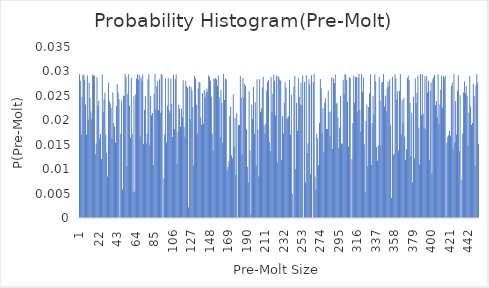
| Category | P.D.F(Pre-Molt) |
|---|---|
| 0 | 0.029 |
| 1 | 0.028 |
| 2 | 0.017 |
| 3 | 0.025 |
| 4 | 0.029 |
| 5 | 0.029 |
| 6 | 0.028 |
| 7 | 0.023 |
| 8 | 0.017 |
| 9 | 0.029 |
| 10 | 0.02 |
| 11 | 0.028 |
| 12 | 0.025 |
| 13 | 0.022 |
| 14 | 0.02 |
| 15 | 0.029 |
| 16 | 0.029 |
| 17 | 0.029 |
| 18 | 0.013 |
| 19 | 0.015 |
| 20 | 0.029 |
| 21 | 0.023 |
| 22 | 0.024 |
| 23 | 0.016 |
| 24 | 0.017 |
| 25 | 0.012 |
| 26 | 0.029 |
| 27 | 0.022 |
| 28 | 0.024 |
| 29 | 0.026 |
| 30 | 0.017 |
| 31 | 0.013 |
| 32 | 0.008 |
| 33 | 0.028 |
| 34 | 0.024 |
| 35 | 0.023 |
| 36 | 0.023 |
| 37 | 0.016 |
| 38 | 0.026 |
| 39 | 0.019 |
| 40 | 0.019 |
| 41 | 0.015 |
| 42 | 0.023 |
| 43 | 0.027 |
| 44 | 0.026 |
| 45 | 0.024 |
| 46 | 0 |
| 47 | 0.017 |
| 48 | 0.024 |
| 49 | 0.006 |
| 50 | 0.025 |
| 51 | 0.025 |
| 52 | 0.029 |
| 53 | 0.029 |
| 54 | 0.011 |
| 55 | 0.025 |
| 56 | 0.029 |
| 57 | 0.023 |
| 58 | 0.016 |
| 59 | 0.029 |
| 60 | 0.017 |
| 61 | 0.005 |
| 62 | 0.025 |
| 63 | 0.005 |
| 64 | 0.025 |
| 65 | 0.029 |
| 66 | 0.029 |
| 67 | 0.028 |
| 68 | 0.029 |
| 69 | 0.017 |
| 70 | 0.029 |
| 71 | 0.028 |
| 72 | 0.029 |
| 73 | 0.015 |
| 74 | 0.022 |
| 75 | 0.025 |
| 76 | 0.015 |
| 77 | 0.017 |
| 78 | 0.028 |
| 79 | 0.029 |
| 80 | 0.015 |
| 81 | 0.025 |
| 82 | 0.021 |
| 83 | 0.021 |
| 84 | 0.011 |
| 85 | 0.025 |
| 86 | 0.029 |
| 87 | 0.022 |
| 88 | 0.027 |
| 89 | 0.028 |
| 90 | 0.022 |
| 91 | 0.028 |
| 92 | 0.022 |
| 93 | 0.029 |
| 94 | 0.029 |
| 95 | 0 |
| 96 | 0.008 |
| 97 | 0.017 |
| 98 | 0.029 |
| 99 | 0.015 |
| 100 | 0.023 |
| 101 | 0.029 |
| 102 | 0.022 |
| 103 | 0.022 |
| 104 | 0.029 |
| 105 | 0.023 |
| 106 | 0.017 |
| 107 | 0.029 |
| 108 | 0.018 |
| 109 | 0.028 |
| 110 | 0.029 |
| 111 | 0.011 |
| 112 | 0.018 |
| 113 | 0.023 |
| 114 | 0.022 |
| 115 | 0.019 |
| 116 | 0.022 |
| 117 | 0.021 |
| 118 | 0.028 |
| 119 | 0.019 |
| 120 | 0.017 |
| 121 | 0.028 |
| 122 | 0.027 |
| 123 | 0.027 |
| 124 | 0.002 |
| 125 | 0.027 |
| 126 | 0.02 |
| 127 | 0.027 |
| 128 | 0.026 |
| 129 | 0.023 |
| 130 | 0.011 |
| 131 | 0.029 |
| 132 | 0.029 |
| 133 | 0.023 |
| 134 | 0.017 |
| 135 | 0.027 |
| 136 | 0.028 |
| 137 | 0.028 |
| 138 | 0.021 |
| 139 | 0.019 |
| 140 | 0.026 |
| 141 | 0.019 |
| 142 | 0.026 |
| 143 | 0.025 |
| 144 | 0.026 |
| 145 | 0.027 |
| 146 | 0.026 |
| 147 | 0.029 |
| 148 | 0.029 |
| 149 | 0.028 |
| 150 | 0.025 |
| 151 | 0.017 |
| 152 | 0.014 |
| 153 | 0.029 |
| 154 | 0.028 |
| 155 | 0.029 |
| 156 | 0.028 |
| 157 | 0.027 |
| 158 | 0.029 |
| 159 | 0.025 |
| 160 | 0.017 |
| 161 | 0.026 |
| 162 | 0.024 |
| 163 | 0.015 |
| 164 | 0.029 |
| 165 | 0.024 |
| 166 | 0.029 |
| 167 | 0.028 |
| 168 | 0.01 |
| 169 | 0.01 |
| 170 | 0.012 |
| 171 | 0.021 |
| 172 | 0.023 |
| 173 | 0.013 |
| 174 | 0.012 |
| 175 | 0.025 |
| 176 | 0.015 |
| 177 | 0.021 |
| 178 | 0.009 |
| 179 | 0.021 |
| 180 | 0 |
| 181 | 0.019 |
| 182 | 0.019 |
| 183 | 0.029 |
| 184 | 0.025 |
| 185 | 0.013 |
| 186 | 0.029 |
| 187 | 0.025 |
| 188 | 0.027 |
| 189 | 0.027 |
| 190 | 0.018 |
| 191 | 0.01 |
| 192 | 0.007 |
| 193 | 0.026 |
| 194 | 0.014 |
| 195 | 0.001 |
| 196 | 0.023 |
| 197 | 0.02 |
| 198 | 0.027 |
| 199 | 0.017 |
| 200 | 0.024 |
| 201 | 0.011 |
| 202 | 0.028 |
| 203 | 0.018 |
| 204 | 0.008 |
| 205 | 0.028 |
| 206 | 0.022 |
| 207 | 0.022 |
| 208 | 0.027 |
| 209 | 0.029 |
| 210 | 0.019 |
| 211 | 0.017 |
| 212 | 0.019 |
| 213 | 0.026 |
| 214 | 0.028 |
| 215 | 0.028 |
| 216 | 0.016 |
| 217 | 0.014 |
| 218 | 0.029 |
| 219 | 0.022 |
| 220 | 0.025 |
| 221 | 0.029 |
| 222 | 0.028 |
| 223 | 0.021 |
| 224 | 0.029 |
| 225 | 0.011 |
| 226 | 0.029 |
| 227 | 0.029 |
| 228 | 0.028 |
| 229 | 0.028 |
| 230 | 0.012 |
| 231 | 0.021 |
| 232 | 0.017 |
| 233 | 0.024 |
| 234 | 0.028 |
| 235 | 0.027 |
| 236 | 0.02 |
| 237 | 0.021 |
| 238 | 0.021 |
| 239 | 0.028 |
| 240 | 0.017 |
| 241 | 0.025 |
| 242 | 0.005 |
| 243 | 0 |
| 244 | 0.027 |
| 245 | 0.029 |
| 246 | 0.01 |
| 247 | 0.024 |
| 248 | 0.018 |
| 249 | 0.029 |
| 250 | 0.025 |
| 251 | 0.023 |
| 252 | 0.028 |
| 253 | 0.023 |
| 254 | 0.029 |
| 255 | 0 |
| 256 | 0.028 |
| 257 | 0.007 |
| 258 | 0.029 |
| 259 | 0.013 |
| 260 | 0.015 |
| 261 | 0.028 |
| 262 | 0.027 |
| 263 | 0.009 |
| 264 | 0.029 |
| 265 | 0 |
| 266 | 0.028 |
| 267 | 0.029 |
| 268 | 0.008 |
| 269 | 0.006 |
| 270 | 0.017 |
| 271 | 0.016 |
| 272 | 0.011 |
| 273 | 0.019 |
| 274 | 0.028 |
| 275 | 0.027 |
| 276 | 0.017 |
| 277 | 0.022 |
| 278 | 0.013 |
| 279 | 0.024 |
| 280 | 0.024 |
| 281 | 0.018 |
| 282 | 0.018 |
| 283 | 0.026 |
| 284 | 0.022 |
| 285 | 0.017 |
| 286 | 0.022 |
| 287 | 0.029 |
| 288 | 0.014 |
| 289 | 0.029 |
| 290 | 0.028 |
| 291 | 0.029 |
| 292 | 0.023 |
| 293 | 0.024 |
| 294 | 0.021 |
| 295 | 0.014 |
| 296 | 0.019 |
| 297 | 0.025 |
| 298 | 0.015 |
| 299 | 0.015 |
| 300 | 0.028 |
| 301 | 0.025 |
| 302 | 0.029 |
| 303 | 0.029 |
| 304 | 0.028 |
| 305 | 0.024 |
| 306 | 0.015 |
| 307 | 0.029 |
| 308 | 0.029 |
| 309 | 0 |
| 310 | 0.012 |
| 311 | 0.019 |
| 312 | 0.029 |
| 313 | 0.024 |
| 314 | 0.029 |
| 315 | 0.029 |
| 316 | 0.022 |
| 317 | 0.029 |
| 318 | 0.029 |
| 319 | 0.022 |
| 320 | 0.018 |
| 321 | 0.029 |
| 322 | 0.026 |
| 323 | 0.029 |
| 324 | 0.015 |
| 325 | 0.005 |
| 326 | 0.02 |
| 327 | 0.023 |
| 328 | 0.011 |
| 329 | 0.023 |
| 330 | 0.026 |
| 331 | 0.029 |
| 332 | 0.011 |
| 333 | 0.019 |
| 334 | 0.025 |
| 335 | 0.021 |
| 336 | 0.029 |
| 337 | 0.028 |
| 338 | 0.014 |
| 339 | 0.012 |
| 340 | 0.015 |
| 341 | 0.029 |
| 342 | 0.024 |
| 343 | 0.015 |
| 344 | 0.028 |
| 345 | 0.028 |
| 346 | 0.029 |
| 347 | 0.023 |
| 348 | 0.025 |
| 349 | 0.022 |
| 350 | 0.027 |
| 351 | 0.028 |
| 352 | 0.027 |
| 353 | 0.028 |
| 354 | 0.019 |
| 355 | 0.004 |
| 356 | 0.029 |
| 357 | 0.013 |
| 358 | 0.013 |
| 359 | 0.029 |
| 360 | 0.029 |
| 361 | 0.024 |
| 362 | 0.026 |
| 363 | 0.014 |
| 364 | 0.026 |
| 365 | 0.029 |
| 366 | 0.017 |
| 367 | 0.024 |
| 368 | 0.019 |
| 369 | 0.025 |
| 370 | 0.017 |
| 371 | 0.012 |
| 372 | 0.014 |
| 373 | 0.029 |
| 374 | 0.029 |
| 375 | 0.028 |
| 376 | 0.024 |
| 377 | 0.013 |
| 378 | 0.022 |
| 379 | 0.007 |
| 380 | 0.025 |
| 381 | 0.012 |
| 382 | 0.029 |
| 383 | 0.024 |
| 384 | 0.026 |
| 385 | 0.029 |
| 386 | 0.018 |
| 387 | 0.011 |
| 388 | 0.029 |
| 389 | 0.021 |
| 390 | 0.029 |
| 391 | 0.021 |
| 392 | 0.019 |
| 393 | 0.029 |
| 394 | 0.018 |
| 395 | 0.029 |
| 396 | 0.026 |
| 397 | 0.028 |
| 398 | 0.012 |
| 399 | 0.026 |
| 400 | 0.028 |
| 401 | 0.009 |
| 402 | 0.028 |
| 403 | 0.029 |
| 404 | 0.029 |
| 405 | 0.023 |
| 406 | 0.024 |
| 407 | 0.021 |
| 408 | 0.029 |
| 409 | 0.019 |
| 410 | 0.023 |
| 411 | 0.026 |
| 412 | 0.029 |
| 413 | 0.023 |
| 414 | 0.029 |
| 415 | 0.029 |
| 416 | 0.029 |
| 417 | 0 |
| 418 | 0.015 |
| 419 | 0.017 |
| 420 | 0.017 |
| 421 | 0.018 |
| 422 | 0.017 |
| 423 | 0.027 |
| 424 | 0.028 |
| 425 | 0.014 |
| 426 | 0.029 |
| 427 | 0.015 |
| 428 | 0.024 |
| 429 | 0.017 |
| 430 | 0.026 |
| 431 | 0.029 |
| 432 | 0.014 |
| 433 | 0.025 |
| 434 | 0 |
| 435 | 0.008 |
| 436 | 0.017 |
| 437 | 0.026 |
| 438 | 0.028 |
| 439 | 0.026 |
| 440 | 0.027 |
| 441 | 0.025 |
| 442 | 0.015 |
| 443 | 0.022 |
| 444 | 0.029 |
| 445 | 0.023 |
| 446 | 0.019 |
| 447 | 0.019 |
| 448 | 0.027 |
| 449 | 0.025 |
| 450 | 0.011 |
| 451 | 0.027 |
| 452 | 0.029 |
| 453 | 0.028 |
| 454 | 0.015 |